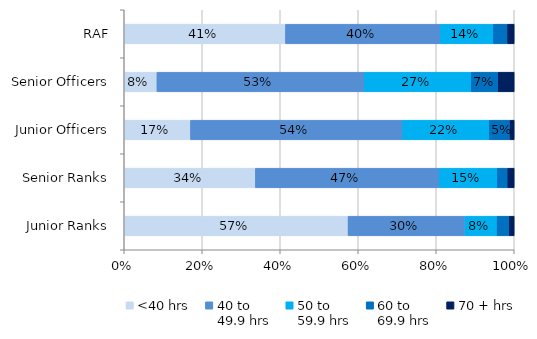
| Category | <40 hrs | 40 to 
49.9 hrs | 50 to 
59.9 hrs | 60 to 
69.9 hrs | 70 + hrs |
|---|---|---|---|---|---|
| RAF | 0.414 | 0.397 | 0.136 | 0.037 | 0.017 |
| Senior Officers | 0.084 | 0.532 | 0.274 | 0.069 | 0.041 |
| Junior Officers | 0.17 | 0.544 | 0.222 | 0.053 | 0.011 |
| Senior Ranks | 0.336 | 0.471 | 0.149 | 0.027 | 0.016 |
| Junior Ranks | 0.574 | 0.3 | 0.082 | 0.031 | 0.013 |